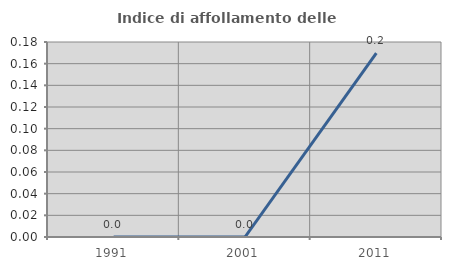
| Category | Indice di affollamento delle abitazioni  |
|---|---|
| 1991.0 | 0 |
| 2001.0 | 0 |
| 2011.0 | 0.17 |